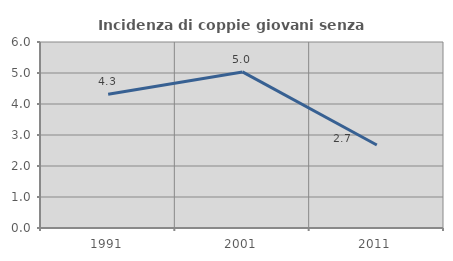
| Category | Incidenza di coppie giovani senza figli |
|---|---|
| 1991.0 | 4.312 |
| 2001.0 | 5.034 |
| 2011.0 | 2.676 |